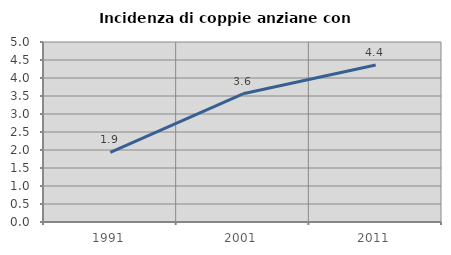
| Category | Incidenza di coppie anziane con figli |
|---|---|
| 1991.0 | 1.935 |
| 2001.0 | 3.561 |
| 2011.0 | 4.36 |